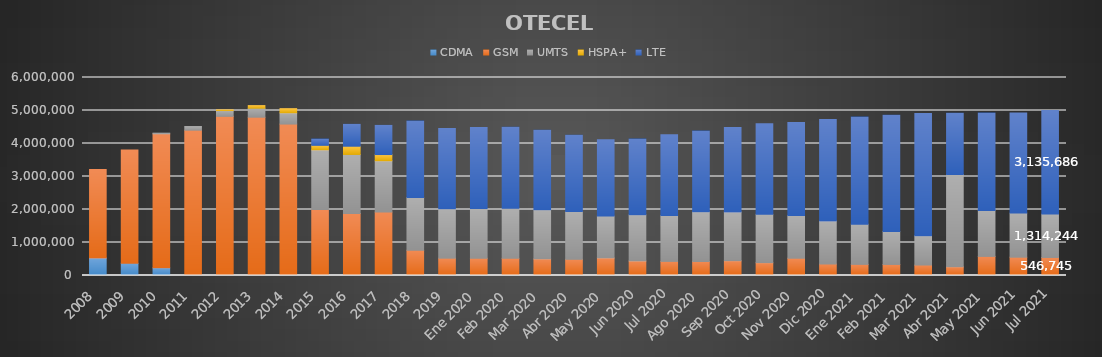
| Category | CDMA | GSM | UMTS | HSPA+ | LTE |
|---|---|---|---|---|---|
| 2008 | 533206 | 2678716 | 0 | 0 | 0 |
| 2009 | 370711 | 3435721 | 0 | 0 | 0 |
| 2010 | 232396 | 4061909 | 20294 | 0 | 0 |
| 2011 | 0 | 4403305 | 110569 | 0 | 0 |
| 2012 | 0 | 4823675 | 174375 | 21636 | 0 |
| 2013 | 0 | 4797632 | 272871 | 77805 | 0 |
| 2014 | 0 | 4589205 | 341647 | 124793 | 0 |
| 2015 | 0 | 2002436 | 1805322 | 136952 | 189988 |
| 2016 | 0 | 1881781 | 1787014 | 248541 | 662756 |
| 2017 | 0 | 1924184.634 | 1552693.066 | 187515.199 | 884631.101 |
| 2018 | 0 | 765658.891 | 1596404.415 | 0 | 2317582.694 |
| 2019 | 0 | 525011.505 | 1498097.705 | 0 | 2433246.79 |
| Ene 2020 | 0 | 523389.568 | 1509766.178 | 0 | 2452622.254 |
| Feb 2020 | 0 | 520017.519 | 1518121.253 | 0 | 2453358.229 |
| Mar 2020 | 0 | 504295.417 | 1490435.081 | 0 | 2409483.502 |
| Abr 2020 | 0 | 490883.546 | 1445156.93 | 0 | 2315911.524 |
| May 2020 | 0 | 533526.941 | 1269174.638 | 0 | 2313001.421 |
| Jun 2020 | 0 | 441417.045 | 1398679.945 | 0 | 2294281.011 |
| Jul 2020 | 0 | 427119.681 | 1389489.558 | 0 | 2449953.761 |
| Ago 2020 | 0 | 424029.106 | 1510481.03 | 0 | 2441398.864 |
| Sep 2020 | 0 | 448233.632 | 1479342.797 | 0 | 2558433.572 |
| Oct 2020 | 0 | 388843.453 | 1465441.838 | 0 | 2747569.708 |
| Nov 2020 | 0 | 523404.763 | 1294725.433 | 0 | 2818032.804 |
| Dic 2020 | 0 | 348601.621 | 1305745.099 | 0 | 3075378.28 |
| Ene 2021 | 0 | 337497.73 | 1218062.841 | 0 | 3245047.428 |
| Feb 2021 | 0 | 335586 | 1001328 | 0 | 3519963 |
| Mar 2021 | 0 | 317629.519 | 889408.345 | 0 | 3702395.135 |
| Abr 2021 | 0 | 261787.025 | 2796805.364 | 0 | 1857237.612 |
| May 2021 | 0 | 579029.657 | 1393260.948 | 0 | 2950954.396 |
| Jun 2021 | 0 | 555052.656 | 1336601.914 | 0 | 3035652.43 |
| Jul 2021 | 0 | 546745.489 | 1314243.999 | 0 | 3135685.512 |